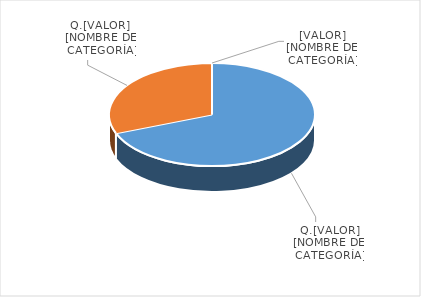
| Category | Series 0 |
|---|---|
| PRESUPUESTO VIGENTE PARA 2023 | 19000000 |
| PRESUPUESTO EJECUTADO  | 8489515.04 |
| PORCENTAJE DE EJECUCIÓN  | 0.447 |